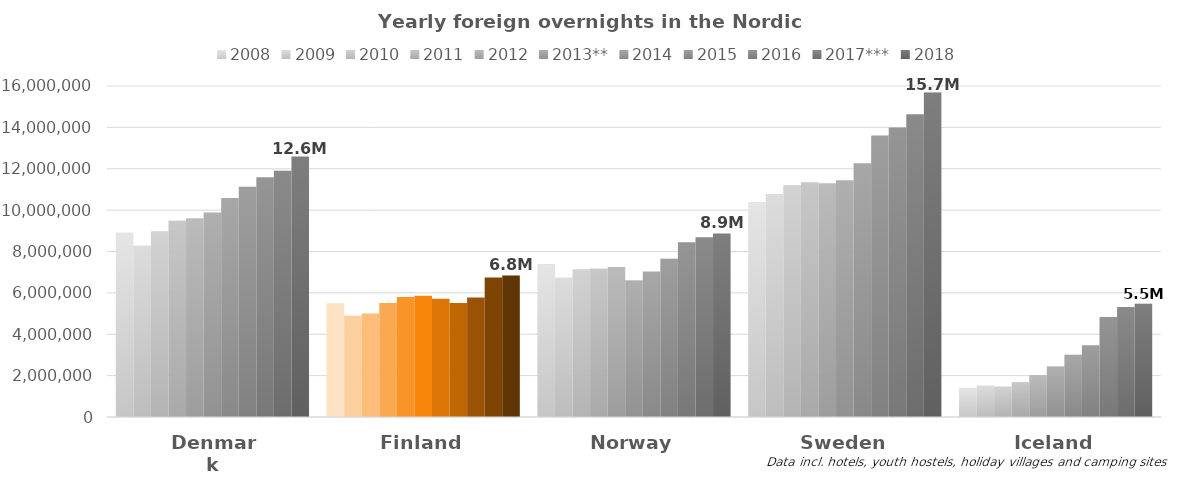
| Category | 2008 | 2009 | 2010 | 2011 | 2012 | 2013** | 2014 | 2015 | 2016 | 2017*** | 2018 |
|---|---|---|---|---|---|---|---|---|---|---|---|
| Denmark | 8901741 | 8279710 | 8962897 | 9480775 | 9591938 | 9889803 | 10583173 | 11124015 | 11583378 | 11907720 | 12595126 |
| Finland | 5502542 | 4890006 | 5005068 | 5507468 | 5802959 | 5860447 | 5710340 | 5510350 | 5771275 | 6742834 | 6842589 |
| Norway | 7369612.642 | 6731713.155 | 7138658 | 7161512 | 7251819 | 6592523 | 7038314 | 7650804 | 8451583 | 8685752 | 8870472 |
| Sweden | 10389021 | 10774646 | 11184995 | 11344435 | 11299455 | 11442690 | 12260712 | 13612924 | 13997265 | 14638702 | 15685681 |
| Iceland | 1403207 | 1512101 | 1476227 | 1686432 | 2028400 | 2439384 | 3009115 | 3469041 | 4830363 | 5322462 | 5470071 |